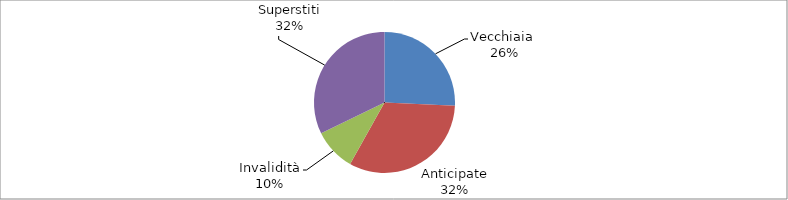
| Category | Series 0 |
|---|---|
| Vecchiaia  | 93256 |
| Anticipate | 117248 |
| Invalidità | 35075 |
| Superstiti | 116683 |